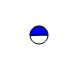
| Category | Series 0 |
|---|---|
| 0 | 13806 |
| 1 | 14287 |